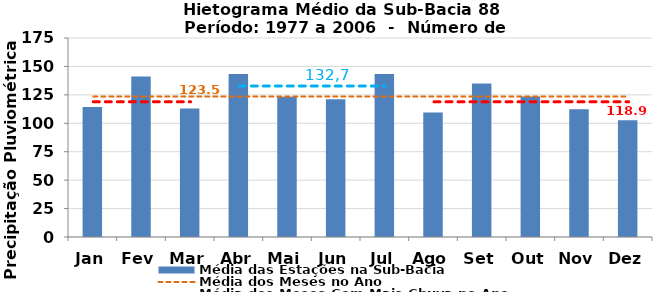
| Category | Média das Estações na Sub-Bacia |
|---|---|
| Jan | 114.261 |
| Fev | 141.157 |
| Mar | 112.99 |
| Abr | 143.264 |
| Mai | 123.234 |
| Jun | 121.097 |
| Jul | 143.4 |
| Ago | 109.518 |
| Set | 134.879 |
| Out | 123.61 |
| Nov | 112.237 |
| Dez | 102.579 |